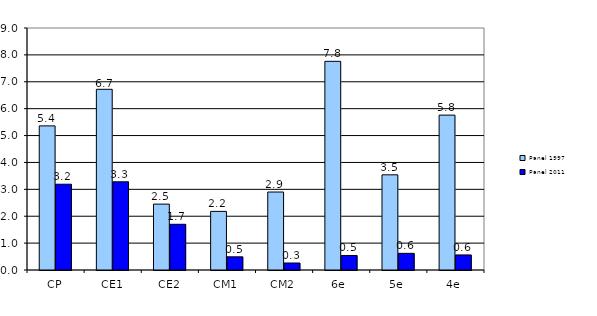
| Category | Panel 1997 | Panel 2011 |
|---|---|---|
| CP | 5.36 | 3.19 |
| CE1 | 6.72 | 3.28 |
| CE2 | 2.45 | 1.7 |
| CM1 | 2.18 | 0.49 |
| CM2 | 2.9 | 0.26 |
| 6e  | 7.76 | 0.54 |
| 5e | 3.54 | 0.62 |
| 4e | 5.76 | 0.56 |